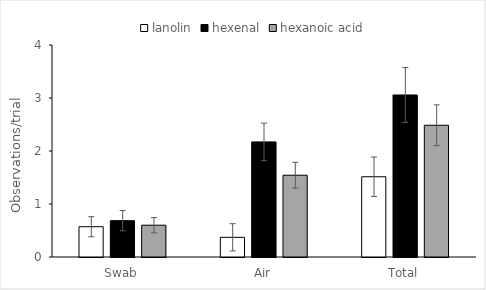
| Category | lanolin | hexenal | hexanoic acid |
|---|---|---|---|
| Swab | 0.571 | 0.686 | 0.6 |
| Air | 0.371 | 2.171 | 1.543 |
| Total | 1.514 | 3.057 | 2.486 |